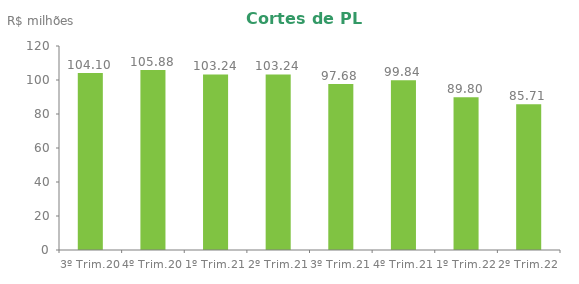
| Category | Series 0 |
|---|---|
| 3º Trim.20 | 104.099 |
| 4º Trim.20 | 105.884 |
| 1º Trim.21 | 103.241 |
| 2º Trim.21 | 103.241 |
| 3º Trim.21 | 97.678 |
| 4º Trim.21 | 99.84 |
| 1º Trim.22 | 89.798 |
| 2º Trim.22 | 85.707 |